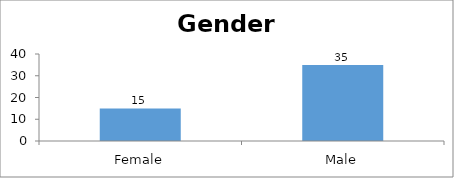
| Category | Gender |
|---|---|
| Female | 15 |
| Male | 35 |